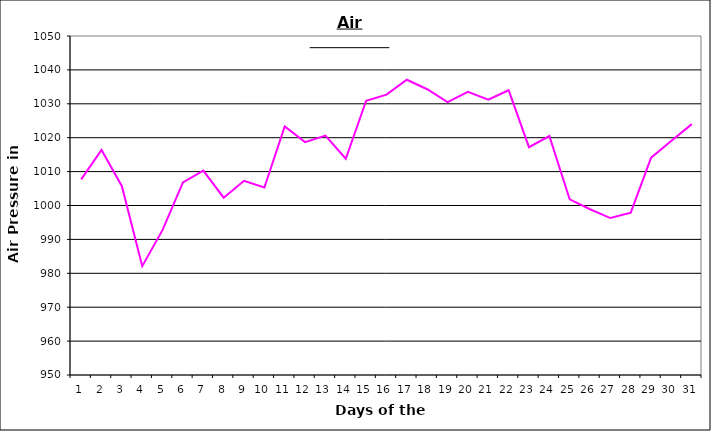
| Category | Series 0 |
|---|---|
| 0 | 1007.7 |
| 1 | 1016.4 |
| 2 | 1005.7 |
| 3 | 982.1 |
| 4 | 992.8 |
| 5 | 1006.8 |
| 6 | 1010.3 |
| 7 | 1002.3 |
| 8 | 1007.3 |
| 9 | 1005.3 |
| 10 | 1023.3 |
| 11 | 1018.7 |
| 12 | 1020.6 |
| 13 | 1013.8 |
| 14 | 1030.9 |
| 15 | 1032.7 |
| 16 | 1037.1 |
| 17 | 1034.3 |
| 18 | 1030.5 |
| 19 | 1033.5 |
| 20 | 1031.2 |
| 21 | 1034 |
| 22 | 1017.2 |
| 23 | 1020.5 |
| 24 | 1001.8 |
| 25 | 998.9 |
| 26 | 996.3 |
| 27 | 997.9 |
| 28 | 1014.1 |
| 29 | 1019.1 |
| 30 | 1024 |